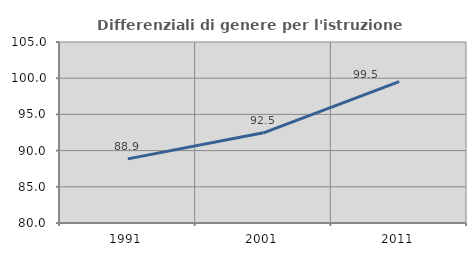
| Category | Differenziali di genere per l'istruzione superiore |
|---|---|
| 1991.0 | 88.853 |
| 2001.0 | 92.458 |
| 2011.0 | 99.522 |